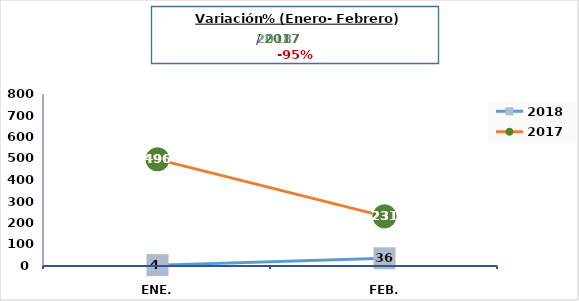
| Category | 2018 | 2017 |
|---|---|---|
| Ene. | 4 | 496 |
| Feb. | 36 | 231 |